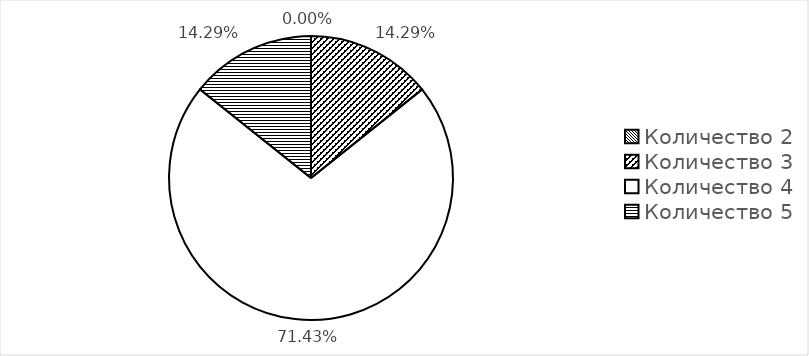
| Category | Series 0 |
|---|---|
| Количество 2 | 0 |
| Количество 3 | 0.143 |
| Количество 4 | 0.714 |
| Количество 5 | 0.143 |